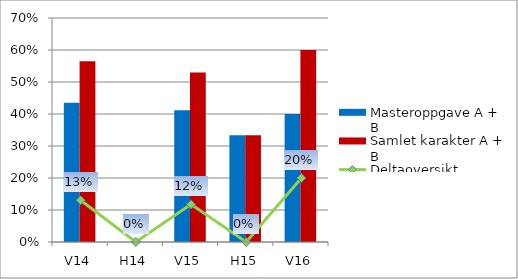
| Category | Masteroppgave A + B | Samlet karakter A + B |
|---|---|---|
| V14 | 0.435 | 0.565 |
| H14 | 0 | 0 |
| V15 | 0.412 | 0.529 |
| H15 | 0.333 | 0.333 |
| V16 | 0.4 | 0.6 |